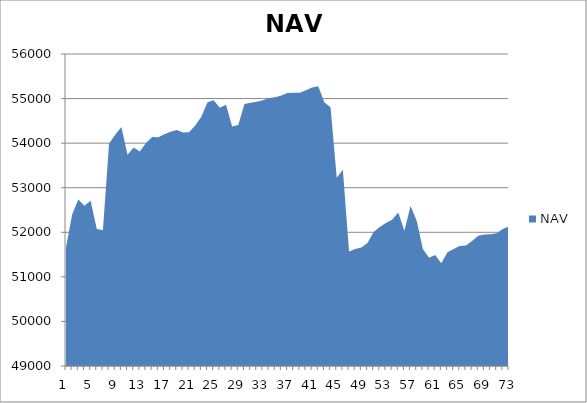
| Category | NAV |
|---|---|
| 0 | 51667 |
| 1 | 52397 |
| 2 | 52733.957 |
| 3 | 52597.875 |
| 4 | 52708.772 |
| 5 | 52075.184 |
| 6 | 52046.775 |
| 7 | 53991.219 |
| 8 | 54189.909 |
| 9 | 54364.909 |
| 10 | 53739.909 |
| 11 | 53899.542 |
| 12 | 53812.294 |
| 13 | 54003.961 |
| 14 | 54140.037 |
| 15 | 54132.37 |
| 16 | 54197.37 |
| 17 | 54255.812 |
| 18 | 54292.622 |
| 19 | 54240.699 |
| 20 | 54246.834 |
| 21 | 54397.391 |
| 22 | 54592.197 |
| 23 | 54920.119 |
| 24 | 54963.245 |
| 25 | 54796.799 |
| 26 | 54863.963 |
| 27 | 54375.975 |
| 28 | 54409.015 |
| 29 | 54878.402 |
| 30 | 54905.151 |
| 31 | 54927.958 |
| 32 | 54964.157 |
| 33 | 55012.385 |
| 34 | 55031.616 |
| 35 | 55070.791 |
| 36 | 55126.461 |
| 37 | 55131.71 |
| 38 | 55133.391 |
| 39 | 55184.783 |
| 40 | 55249.119 |
| 41 | 55278.196 |
| 42 | 54909.993 |
| 43 | 54807.052 |
| 44 | 53224.092 |
| 45 | 53401.214 |
| 46 | 51567.133 |
| 47 | 51627.536 |
| 48 | 51656.382 |
| 49 | 51762.295 |
| 50 | 52007.329 |
| 51 | 52120.149 |
| 52 | 52206.26 |
| 53 | 52279.944 |
| 54 | 52443.406 |
| 55 | 52034.315 |
| 56 | 52592.093 |
| 57 | 52259.795 |
| 58 | 51622.988 |
| 59 | 51427.586 |
| 60 | 51492.401 |
| 61 | 51307.336 |
| 62 | 51550.9 |
| 63 | 51625.058 |
| 64 | 51693.986 |
| 65 | 51704.014 |
| 66 | 51802.294 |
| 67 | 51922.294 |
| 68 | 51950.294 |
| 69 | 51956.603 |
| 70 | 51977.321 |
| 71 | 52075.871 |
| 72 | 52130.417 |